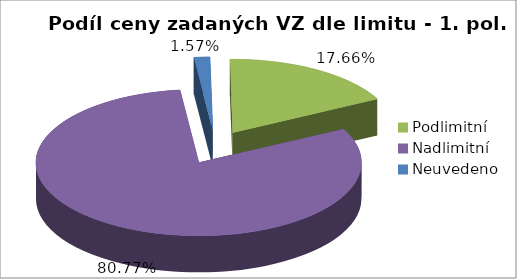
| Category | Series 0 |
|---|---|
| Podlimitní | 34926.688 |
| Nadlimitní | 159743.558 |
| Neuvedeno | 3100.521 |